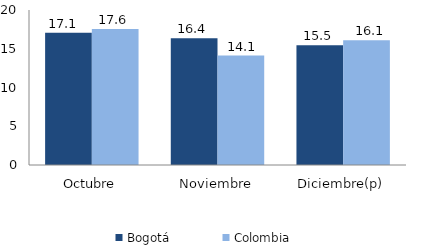
| Category | Bogotá | Colombia |
|---|---|---|
| Octubre | 17.061 | 17.561 |
| Noviembre | 16.365 | 14.115 |
| Diciembre(p) | 15.465 | 16.104 |